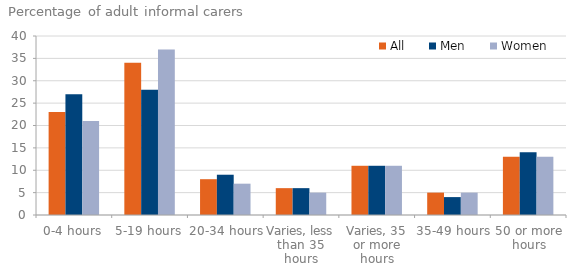
| Category | All | Men | Women |
|---|---|---|---|
| 0-4 hours | 23 | 27 | 21 |
| 5-19 hours | 34 | 28 | 37 |
| 20-34 hours | 8 | 9 | 7 |
| Varies, less than 35 hours | 6 | 6 | 5 |
| Varies, 35 or more hours | 11 | 11 | 11 |
| 35-49 hours | 5 | 4 | 5 |
| 50 or more hours | 13 | 14 | 13 |